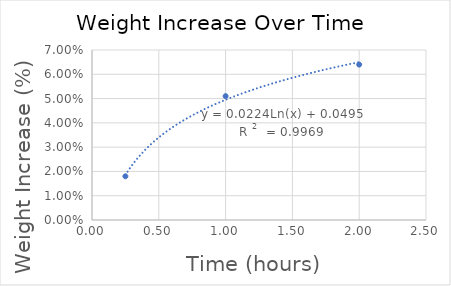
| Category | Series 0 |
|---|---|
| 0.25 | 0.018 |
| 1.0 | 0.051 |
| 2.0 | 0.064 |